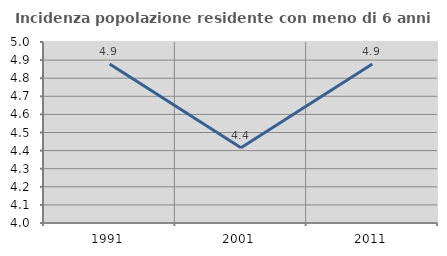
| Category | Incidenza popolazione residente con meno di 6 anni |
|---|---|
| 1991.0 | 4.879 |
| 2001.0 | 4.416 |
| 2011.0 | 4.878 |